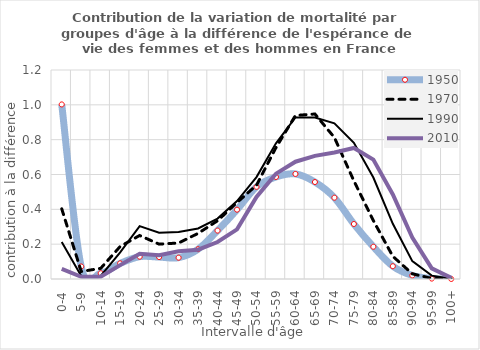
| Category | 1950 | 1970 | 1990 | 2010 |
|---|---|---|---|---|
| 0-4 | 1.002 | 0.403 | 0.212 | 0.058 |
| 5-9 | 0.072 | 0.043 | 0.017 | 0.013 |
| 10-14 | 0.033 | 0.061 | 0.018 | 0.013 |
| 15-19 | 0.09 | 0.187 | 0.153 | 0.08 |
| 20-24 | 0.128 | 0.25 | 0.303 | 0.144 |
| 25-29 | 0.126 | 0.2 | 0.265 | 0.137 |
| 30-34 | 0.122 | 0.207 | 0.27 | 0.159 |
| 35-39 | 0.171 | 0.262 | 0.29 | 0.168 |
| 40-44 | 0.278 | 0.334 | 0.347 | 0.212 |
| 45-49 | 0.398 | 0.439 | 0.447 | 0.285 |
| 50-54 | 0.529 | 0.538 | 0.585 | 0.471 |
| 55-59 | 0.586 | 0.754 | 0.779 | 0.605 |
| 60-64 | 0.603 | 0.939 | 0.927 | 0.673 |
| 65-69 | 0.557 | 0.947 | 0.927 | 0.707 |
| 70-74 | 0.467 | 0.812 | 0.894 | 0.726 |
| 75-79 | 0.316 | 0.563 | 0.782 | 0.752 |
| 80-84 | 0.185 | 0.335 | 0.583 | 0.685 |
| 85-89 | 0.073 | 0.13 | 0.317 | 0.485 |
| 90-94 | 0.02 | 0.03 | 0.103 | 0.238 |
| 95-99 | 0.002 | 0.003 | 0.019 | 0.061 |
| 100+ | 0 | 0 | 0.001 | 0.007 |